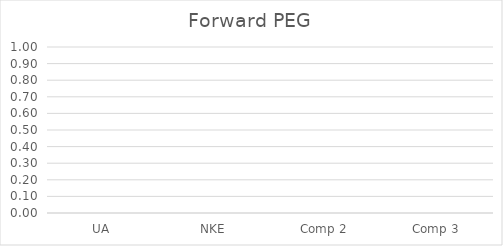
| Category | Forward PEG |
|---|---|
| UA | 0 |
| NKE | 0 |
| Comp 2 | 0 |
| Comp 3 | 0 |